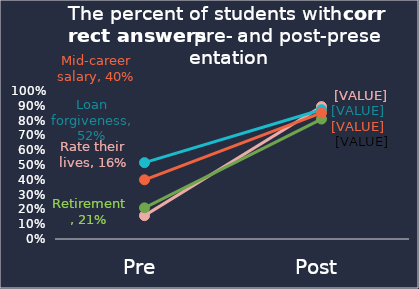
| Category | Rate their lives | Loan forgiveness | Retirement | Mid-career salary |
|---|---|---|---|---|
| Pre | 0.158 | 0.516 | 0.211 | 0.4 |
| Post | 0.895 | 0.874 | 0.811 | 0.853 |